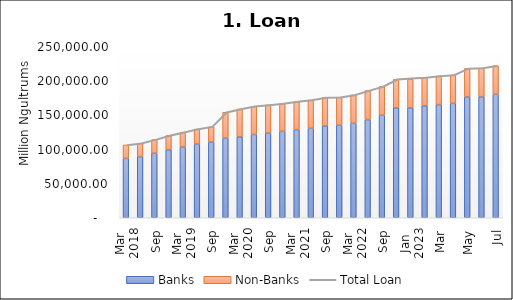
| Category | Banks | Non-Banks |
|---|---|---|
| 0 | 86839.062 | 19536.13 |
| 1 | 89492.789 | 19317.924 |
| 2 | 94257.106 | 19993.763 |
| 3 | 99542.627 | 20696.164 |
| 4 | 103455.022 | 21541.616 |
| 5 | 107823.786 | 21766.128 |
| 6 | 110793.514 | 22289.762 |
| 7 | 116541.685 | 37784.488 |
| 8 | 118433.441 | 40493.857 |
| 9 | 121831.338 | 40869.086 |
| 10 | 123947.936 | 40898.135 |
| 11 | 126363.799 | 40625.692 |
| 12 | 128951.639 | 40851.287 |
| 13 | 130897.833 | 41243.55 |
| 14 | 134359.87 | 41428.68 |
| 15 | 135415.887 | 40793.4 |
| 16 | 138284.661 | 41288.566 |
| 17 | 143532.338 | 42375.24 |
| 18 | 149966.968 | 41992.436 |
| 19 | 160873.72 | 41509.575 |
| 20 | 160873.72 | 41509.575 |
| 21 | 163784.222 | 41233.942 |
| 22 | 165428.061 | 41861.82 |
| 23 | 167303.912 | 41496.685 |
| 24 | 176700.108 | 41607.518 |
| 25 | 176977.708 | 41819.738 |
| 26 | 180513.181 | 41855.293 |